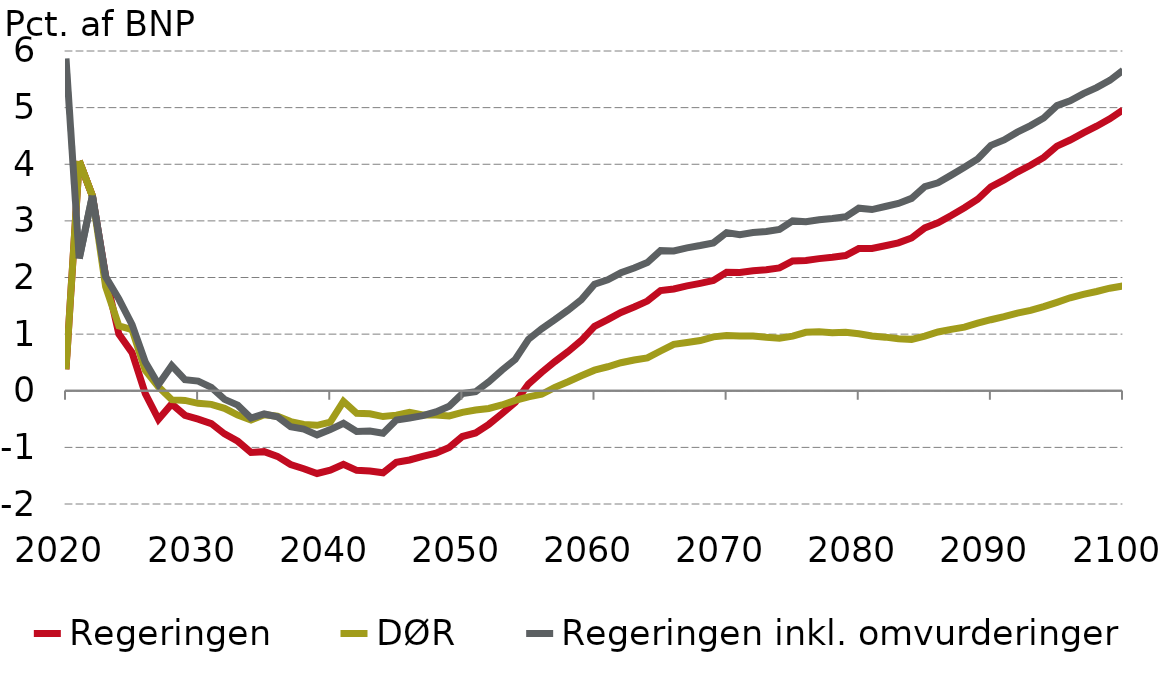
| Category |  Regeringen |  DØR |  Regeringen inkl. omvurderinger |
|---|---|---|---|
| 0 | 0.38 | 0.38 | 5.867 |
| 1 | 4.057 | 4.057 | 2.337 |
| 2 | 3.44 | 3.44 | 3.444 |
| 3 | 2.025 | 1.84 | 2.011 |
| 4 | 1.002 | 1.147 | 1.619 |
| 5 | 0.673 | 1.081 | 1.167 |
| 6 | -0.051 | 0.362 | 0.509 |
| 7 | -0.504 | 0.07 | 0.112 |
| 8 | -0.234 | -0.158 | 0.444 |
| 9 | -0.433 | -0.171 | 0.196 |
| 10 | -0.502 | -0.223 | 0.17 |
| 11 | -0.58 | -0.241 | 0.059 |
| 12 | -0.762 | -0.311 | -0.152 |
| 13 | -0.892 | -0.429 | -0.254 |
| 14 | -1.089 | -0.517 | -0.483 |
| 15 | -1.076 | -0.422 | -0.41 |
| 16 | -1.159 | -0.449 | -0.459 |
| 17 | -1.303 | -0.545 | -0.637 |
| 18 | -1.377 | -0.594 | -0.676 |
| 19 | -1.461 | -0.61 | -0.779 |
| 20 | -1.403 | -0.555 | -0.686 |
| 21 | -1.298 | -0.188 | -0.574 |
| 22 | -1.405 | -0.399 | -0.721 |
| 23 | -1.419 | -0.407 | -0.713 |
| 24 | -1.45 | -0.456 | -0.752 |
| 25 | -1.262 | -0.431 | -0.518 |
| 26 | -1.223 | -0.382 | -0.482 |
| 27 | -1.158 | -0.426 | -0.441 |
| 28 | -1.103 | -0.43 | -0.374 |
| 29 | -1.003 | -0.445 | -0.274 |
| 30 | -0.808 | -0.383 | -0.051 |
| 31 | -0.746 | -0.341 | -0.018 |
| 32 | -0.593 | -0.312 | 0.157 |
| 33 | -0.404 | -0.252 | 0.365 |
| 34 | -0.204 | -0.171 | 0.554 |
| 35 | 0.119 | -0.107 | 0.909 |
| 36 | 0.325 | -0.062 | 1.095 |
| 37 | 0.515 | 0.06 | 1.255 |
| 38 | 0.691 | 0.159 | 1.424 |
| 39 | 0.887 | 0.265 | 1.608 |
| 40 | 1.137 | 0.363 | 1.881 |
| 41 | 1.255 | 0.424 | 1.96 |
| 42 | 1.382 | 0.495 | 2.083 |
| 43 | 1.479 | 0.544 | 2.169 |
| 44 | 1.583 | 0.581 | 2.264 |
| 45 | 1.769 | 0.702 | 2.475 |
| 46 | 1.797 | 0.819 | 2.468 |
| 47 | 1.851 | 0.852 | 2.524 |
| 48 | 1.897 | 0.887 | 2.565 |
| 49 | 1.947 | 0.952 | 2.612 |
| 50 | 2.094 | 0.976 | 2.793 |
| 51 | 2.088 | 0.969 | 2.758 |
| 52 | 2.118 | 0.966 | 2.794 |
| 53 | 2.136 | 0.944 | 2.813 |
| 54 | 2.17 | 0.928 | 2.848 |
| 55 | 2.292 | 0.965 | 3 |
| 56 | 2.302 | 1.033 | 2.984 |
| 57 | 2.333 | 1.041 | 3.021 |
| 58 | 2.357 | 1.026 | 3.043 |
| 59 | 2.388 | 1.034 | 3.072 |
| 60 | 2.511 | 1.007 | 3.224 |
| 61 | 2.513 | 0.968 | 3.2 |
| 62 | 2.56 | 0.947 | 3.254 |
| 63 | 2.611 | 0.917 | 3.308 |
| 64 | 2.697 | 0.907 | 3.397 |
| 65 | 2.875 | 0.964 | 3.604 |
| 66 | 2.966 | 1.038 | 3.673 |
| 67 | 3.095 | 1.083 | 3.808 |
| 68 | 3.233 | 1.123 | 3.947 |
| 69 | 3.383 | 1.193 | 4.094 |
| 70 | 3.602 | 1.254 | 4.334 |
| 71 | 3.723 | 1.31 | 4.429 |
| 72 | 3.861 | 1.372 | 4.567 |
| 73 | 3.982 | 1.42 | 4.683 |
| 74 | 4.119 | 1.486 | 4.818 |
| 75 | 4.319 | 1.562 | 5.035 |
| 76 | 4.428 | 1.643 | 5.119 |
| 77 | 4.554 | 1.703 | 5.247 |
| 78 | 4.672 | 1.752 | 5.354 |
| 79 | 4.802 | 1.811 | 5.481 |
| 80 | 4.96 | 1.852 | 5.659 |